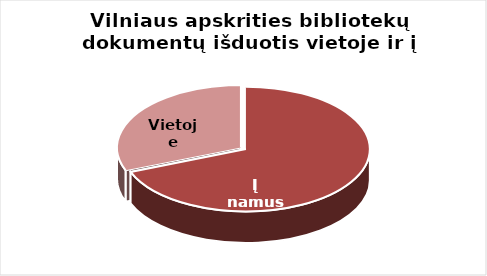
| Category | Series 0 |
|---|---|
| Į namus | 1783928 |
| Vietoje | 800361 |